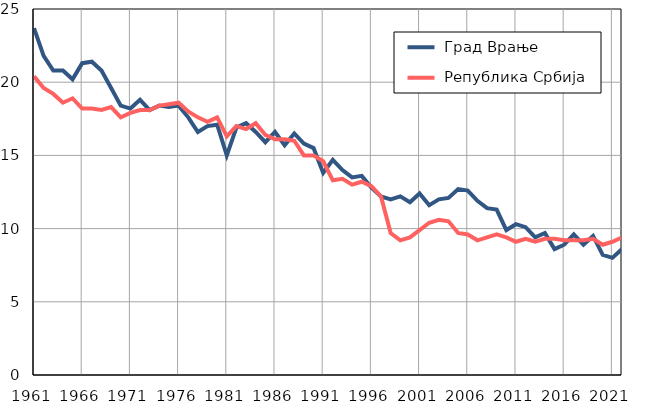
| Category |  Град Врање |  Република Србија |
|---|---|---|
| 1961.0 | 23.7 | 20.4 |
| 1962.0 | 21.8 | 19.6 |
| 1963.0 | 20.8 | 19.2 |
| 1964.0 | 20.8 | 18.6 |
| 1965.0 | 20.2 | 18.9 |
| 1966.0 | 21.3 | 18.2 |
| 1967.0 | 21.4 | 18.2 |
| 1968.0 | 20.8 | 18.1 |
| 1969.0 | 19.6 | 18.3 |
| 1970.0 | 18.4 | 17.6 |
| 1971.0 | 18.2 | 17.9 |
| 1972.0 | 18.8 | 18.1 |
| 1973.0 | 18.1 | 18.1 |
| 1974.0 | 18.4 | 18.4 |
| 1975.0 | 18.3 | 18.5 |
| 1976.0 | 18.4 | 18.6 |
| 1977.0 | 17.6 | 18 |
| 1978.0 | 16.6 | 17.6 |
| 1979.0 | 17 | 17.3 |
| 1980.0 | 17.1 | 17.6 |
| 1981.0 | 15 | 16.3 |
| 1982.0 | 16.9 | 17 |
| 1983.0 | 17.2 | 16.8 |
| 1984.0 | 16.6 | 17.2 |
| 1985.0 | 15.9 | 16.4 |
| 1986.0 | 16.6 | 16.1 |
| 1987.0 | 15.7 | 16.1 |
| 1988.0 | 16.5 | 16 |
| 1989.0 | 15.8 | 15 |
| 1990.0 | 15.5 | 15 |
| 1991.0 | 13.8 | 14.6 |
| 1992.0 | 14.7 | 13.3 |
| 1993.0 | 14 | 13.4 |
| 1994.0 | 13.5 | 13 |
| 1995.0 | 13.6 | 13.2 |
| 1996.0 | 12.8 | 12.9 |
| 1997.0 | 12.2 | 12.2 |
| 1998.0 | 12 | 9.7 |
| 1999.0 | 12.2 | 9.2 |
| 2000.0 | 11.8 | 9.4 |
| 2001.0 | 12.4 | 9.9 |
| 2002.0 | 11.6 | 10.4 |
| 2003.0 | 12 | 10.6 |
| 2004.0 | 12.1 | 10.5 |
| 2005.0 | 12.7 | 9.7 |
| 2006.0 | 12.6 | 9.6 |
| 2007.0 | 11.9 | 9.2 |
| 2008.0 | 11.4 | 9.4 |
| 2009.0 | 11.3 | 9.6 |
| 2010.0 | 9.9 | 9.4 |
| 2011.0 | 10.3 | 9.1 |
| 2012.0 | 10.1 | 9.3 |
| 2013.0 | 9.4 | 9.1 |
| 2014.0 | 9.7 | 9.3 |
| 2015.0 | 8.6 | 9.3 |
| 2016.0 | 8.9 | 9.2 |
| 2017.0 | 9.6 | 9.2 |
| 2018.0 | 8.9 | 9.2 |
| 2019.0 | 9.5 | 9.3 |
| 2020.0 | 8.2 | 8.9 |
| 2021.0 | 8 | 9.1 |
| 2022.0 | 8.6 | 9.4 |